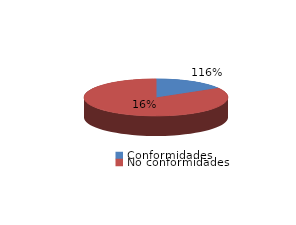
| Category | Series 0 |
|---|---|
| Conformidades | 1255 |
| No conformidades | -177 |